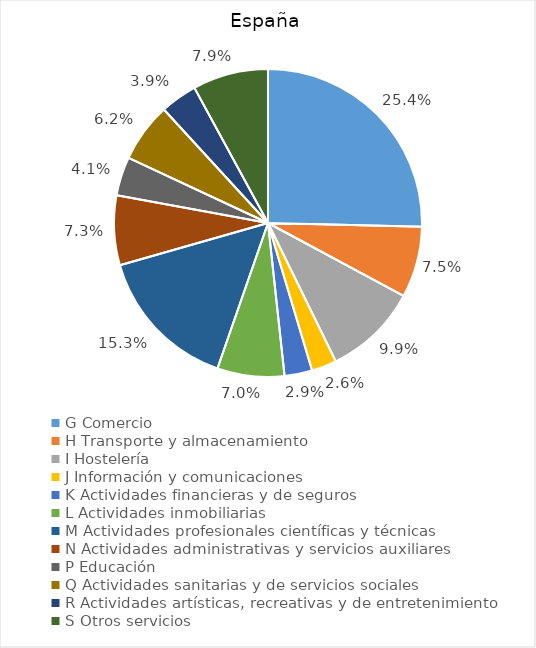
| Category | Series 0 |
|---|---|
| G Comercio | 714227 |
| H Transporte y almacenamiento | 210017 |
| I Hostelería | 278326 |
| J Información y comunicaciones | 73919 |
| K Actividades financieras y de seguros | 81710 |
| L Actividades inmobiliarias | 198139 |
| M Actividades profesionales científicas y técnicas | 429313 |
| N Actividades administrativas y servicios auxiliares | 205394 |
| P Educación | 114642 |
| Q Actividades sanitarias y de servicios sociales | 175092 |
| R Actividades artísticas, recreativas y de entretenimiento | 109141 |
| S Otros servicios | 223281 |